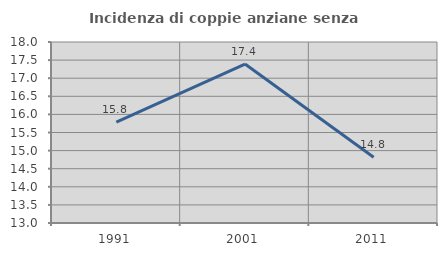
| Category | Incidenza di coppie anziane senza figli  |
|---|---|
| 1991.0 | 15.789 |
| 2001.0 | 17.391 |
| 2011.0 | 14.815 |